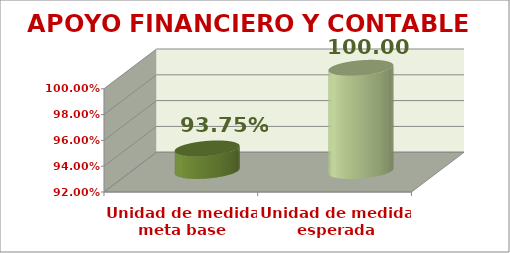
| Category | APOYO FINANCIERO Y CONTABLE |
|---|---|
| Unidad de medida meta base | 0.938 |
| Unidad de medida esperada | 1 |